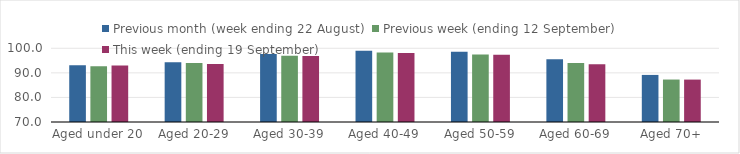
| Category | Previous month (week ending 22 August) | Previous week (ending 12 September) | This week (ending 19 September) |
|---|---|---|---|
| Aged under 20 | 93.11 | 92.68 | 93.02 |
| Aged 20-29 | 94.31 | 94.02 | 93.56 |
| Aged 30-39 | 97.72 | 97 | 96.86 |
| Aged 40-49 | 99.02 | 98.27 | 98.09 |
| Aged 50-59 | 98.56 | 97.5 | 97.39 |
| Aged 60-69 | 95.58 | 94.01 | 93.53 |
| Aged 70+ | 89.16 | 87.28 | 87.26 |